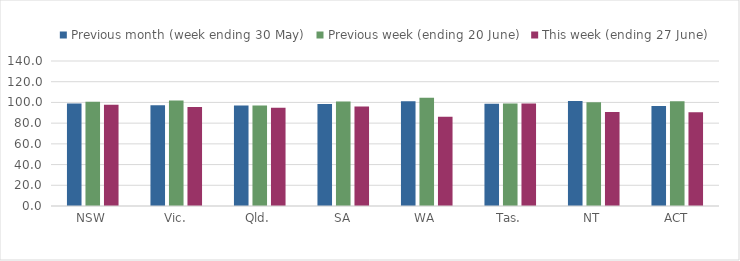
| Category | Previous month (week ending 30 May) | Previous week (ending 20 June) | This week (ending 27 June) |
|---|---|---|---|
| NSW | 99.058 | 100.709 | 97.666 |
| Vic. | 97.375 | 101.856 | 95.532 |
| Qld. | 96.939 | 96.973 | 94.747 |
| SA | 98.412 | 100.828 | 96.139 |
| WA | 101.17 | 104.437 | 86.202 |
| Tas. | 98.621 | 98.87 | 98.87 |
| NT | 101.46 | 100.251 | 90.878 |
| ACT | 96.575 | 101.236 | 90.635 |